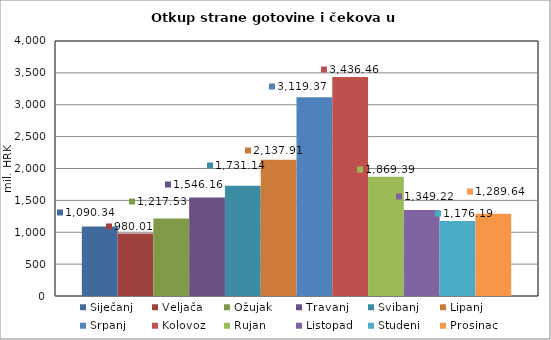
| Category | Siječanj | Veljača | Ožujak | Travanj | Svibanj | Lipanj | Srpanj | Kolovoz | Rujan | Listopad | Studeni | Prosinac |
|---|---|---|---|---|---|---|---|---|---|---|---|---|
| 0 | 1090.34 | 980.012 | 1217.532 | 1546.16 | 1731.143 | 2137.911 | 3119.366 | 3436.46 | 1869.386 | 1349.218 | 1176.185 | 1289.643 |